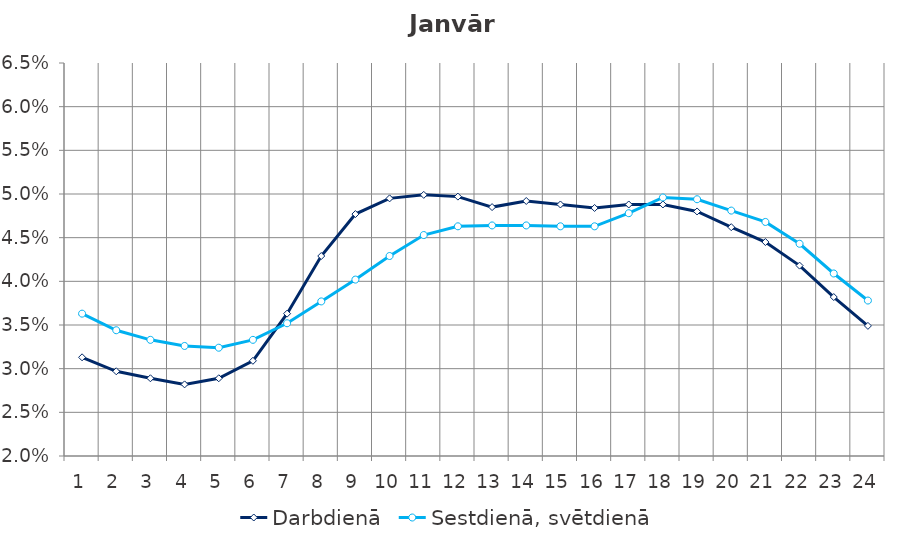
| Category | Darbdienā | Sestdienā, svētdienā |
|---|---|---|
| 1.0 | 0.031 | 0.036 |
| 2.0 | 0.03 | 0.034 |
| 3.0 | 0.029 | 0.033 |
| 4.0 | 0.028 | 0.033 |
| 5.0 | 0.029 | 0.032 |
| 6.0 | 0.031 | 0.033 |
| 7.0 | 0.036 | 0.035 |
| 8.0 | 0.043 | 0.038 |
| 9.0 | 0.048 | 0.04 |
| 10.0 | 0.05 | 0.043 |
| 11.0 | 0.05 | 0.045 |
| 12.0 | 0.05 | 0.046 |
| 13.0 | 0.048 | 0.046 |
| 14.0 | 0.049 | 0.046 |
| 15.0 | 0.049 | 0.046 |
| 16.0 | 0.048 | 0.046 |
| 17.0 | 0.049 | 0.048 |
| 18.0 | 0.049 | 0.05 |
| 19.0 | 0.048 | 0.049 |
| 20.0 | 0.046 | 0.048 |
| 21.0 | 0.045 | 0.047 |
| 22.0 | 0.042 | 0.044 |
| 23.0 | 0.038 | 0.041 |
| 24.0 | 0.035 | 0.038 |